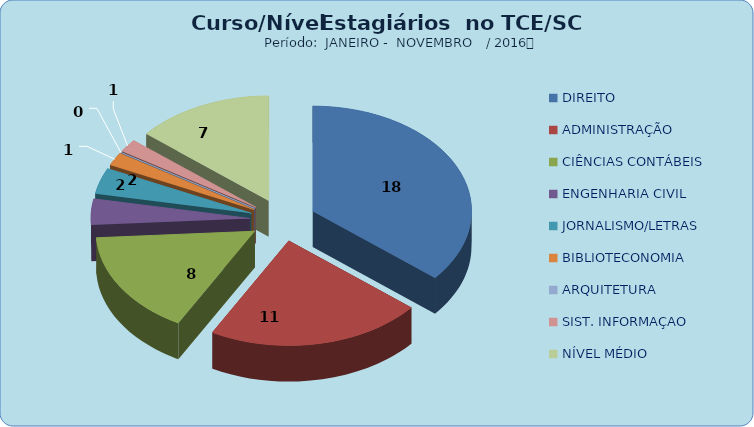
| Category | Series 0 |
|---|---|
| DIREITO | 18 |
| ADMINISTRAÇÃO | 11 |
| CIÊNCIAS CONTÁBEIS | 8 |
| ENGENHARIA CIVIL | 2 |
| JORNALISMO/LETRAS | 2 |
| BIBLIOTECONOMIA | 1 |
| ARQUITETURA | 0 |
| SIST. INFORMAÇAO | 1 |
| NÍVEL MÉDIO | 7 |